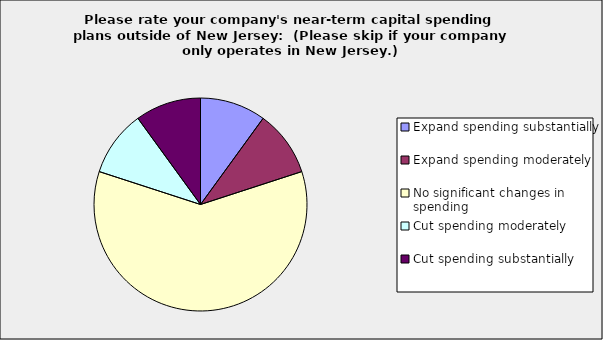
| Category | Series 0 |
|---|---|
| Expand spending substantially | 0.1 |
| Expand spending moderately | 0.1 |
| No significant changes in spending | 0.6 |
| Cut spending moderately | 0.1 |
| Cut spending substantially | 0.1 |